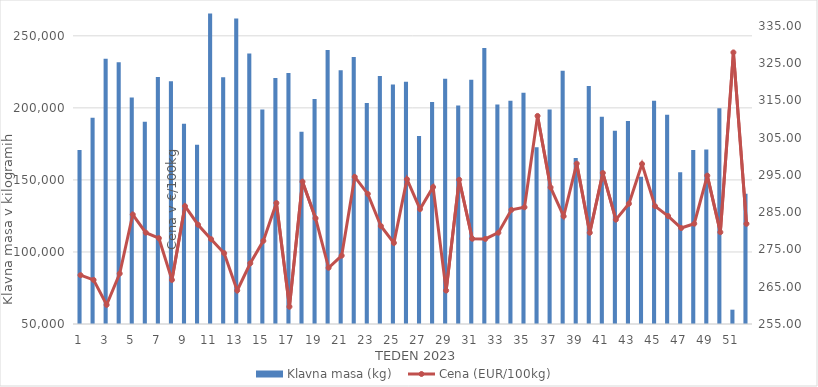
| Category | Klavna masa (kg) |
|---|---|
| 0 | 170843 |
| 1 | 193093 |
| 2 | 234042 |
| 3 | 231737 |
| 4 | 207136 |
| 5 | 190311 |
| 6 | 221366 |
| 7 | 218470 |
| 8 | 189006 |
| 9 | 174425 |
| 10 | 265476 |
| 11 | 221171 |
| 12 | 262102 |
| 13 | 237813 |
| 14 | 198828 |
| 15 | 220686 |
| 16 | 224192 |
| 17 | 183508 |
| 18 | 206133 |
| 19 | 240223 |
| 20 | 226050 |
| 21 | 235273 |
| 22 | 203306 |
| 23 | 222178 |
| 24 | 216259 |
| 25 | 218064 |
| 26 | 180556 |
| 27 | 204078 |
| 28 | 220162 |
| 29 | 201649 |
| 30 | 219538 |
| 31 | 241549 |
| 32 | 202261 |
| 33 | 204903 |
| 34 | 210575 |
| 35 | 172745 |
| 36 | 198877 |
| 37 | 225730 |
| 38 | 165273 |
| 39 | 215175 |
| 40 | 193769 |
| 41 | 184122 |
| 42 | 190834 |
| 43 | 152119 |
| 44 | 204974 |
| 45 | 195179 |
| 46 | 155300 |
| 47 | 170687 |
| 48 | 171040 |
| 49 | 199802 |
| 50 | 59936 |
| 51 | 140361 |